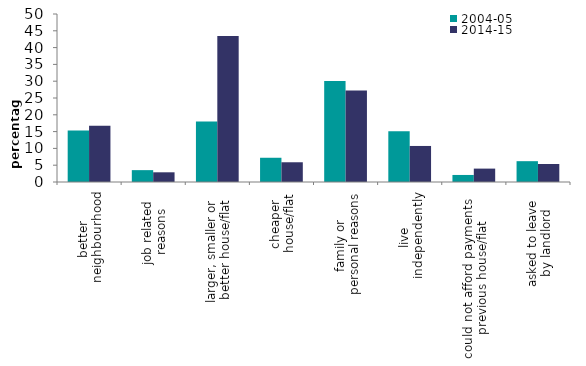
| Category | 2004-05 | 2014-15 |
|---|---|---|
| better 
neighbourhood | 15.32 | 16.735 |
| job related 
reasons | 3.531 | 2.887 |
| larger, smaller or 
better house/flat | 17.969 | 43.434 |
| cheaper 
house/flat | 7.215 | 5.873 |
| family or 
personal reasons | 30.035 | 27.236 |
| live 
independently | 15.132 | 10.726 |
| could not afford payments 
previous house/flat | 2.095 | 3.986 |
| asked to leave 
by landlord  | 6.198 | 5.356 |